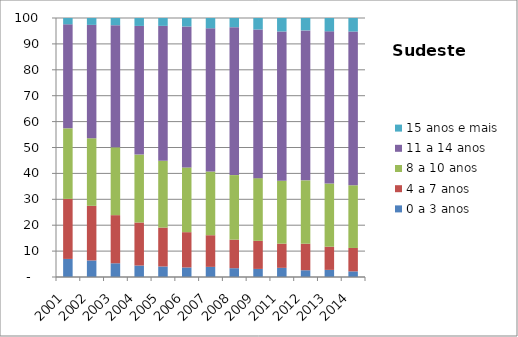
| Category | 0 a 3 anos | 4 a 7 anos | 8 a 10 anos | 11 a 14 anos | 15 anos e mais |
|---|---|---|---|---|---|
| 2001.0 | 6.98 | 23.18 | 27.24 | 40.16 | 2.44 |
| 2002.0 | 6.4 | 21.09 | 26.08 | 43.78 | 2.66 |
| 2003.0 | 5.3 | 18.58 | 26.18 | 47.16 | 2.79 |
| 2004.0 | 4.43 | 16.61 | 26.23 | 49.67 | 3.06 |
| 2005.0 | 4.06 | 15.02 | 25.8 | 52.09 | 3.04 |
| 2006.0 | 3.68 | 13.63 | 24.99 | 54.43 | 3.27 |
| 2007.0 | 3.91 | 12.22 | 24.6 | 55.29 | 3.98 |
| 2008.0 | 3.4 | 11.03 | 24.91 | 57.11 | 3.54 |
| 2009.0 | 3.12 | 10.84 | 24.21 | 57.39 | 4.44 |
| 2011.0 | 3.54 | 9.34 | 24.3 | 57.62 | 5.2 |
| 2012.0 | 2.61 | 10.24 | 24.47 | 57.9 | 4.77 |
| 2013.0 | 2.75 | 8.95 | 24.39 | 58.76 | 5.16 |
| 2014.0 | 2.18 | 9.03 | 24.2 | 59.37 | 5.21 |